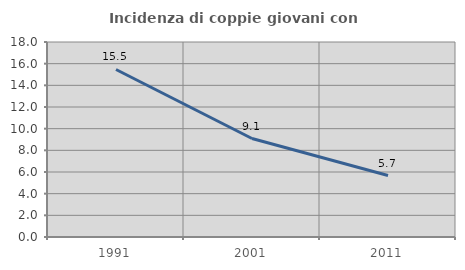
| Category | Incidenza di coppie giovani con figli |
|---|---|
| 1991.0 | 15.464 |
| 2001.0 | 9.091 |
| 2011.0 | 5.674 |